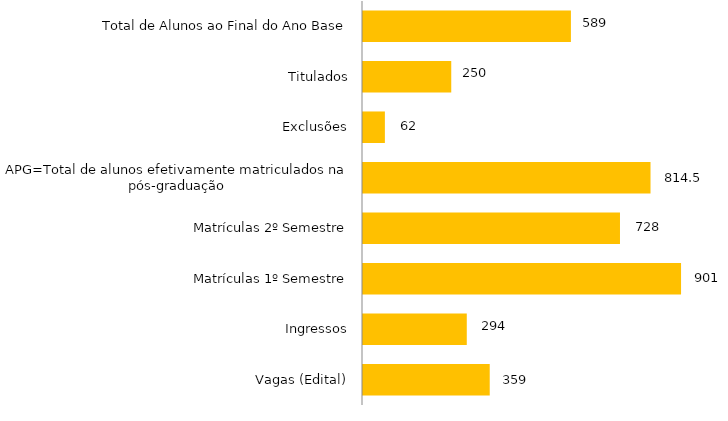
| Category | Curso |
|---|---|
| Vagas (Edital) | 359 |
| Ingressos | 294 |
| Matrículas 1º Semestre | 901 |
| Matrículas 2º Semestre | 728 |
| APG=Total de alunos efetivamente matriculados na pós-graduação | 814.5 |
| Exclusões | 62 |
| Titulados | 250 |
| Total de Alunos ao Final do Ano Base | 589 |